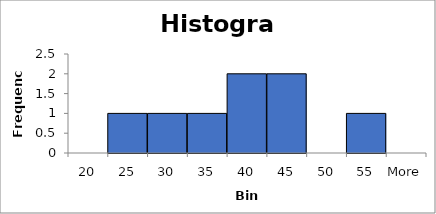
| Category | Frequency |
|---|---|
| 20 | 0 |
| 25 | 1 |
| 30 | 1 |
| 35 | 1 |
| 40 | 2 |
| 45 | 2 |
| 50 | 0 |
| 55 | 1 |
| More | 0 |